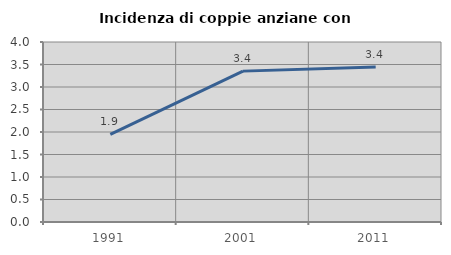
| Category | Incidenza di coppie anziane con figli |
|---|---|
| 1991.0 | 1.946 |
| 2001.0 | 3.353 |
| 2011.0 | 3.444 |